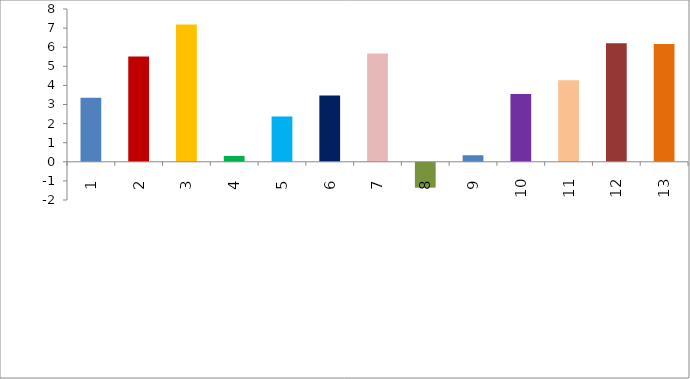
| Category | Series 0 |
|---|---|
| 0 | 3.351 |
| 1 | 5.513 |
| 2 | 7.192 |
| 3 | 0.31 |
| 4 | 2.373 |
| 5 | 3.476 |
| 6 | 5.676 |
| 7 | -1.355 |
| 8 | 0.343 |
| 9 | 3.551 |
| 10 | 4.273 |
| 11 | 6.205 |
| 12 | 6.169 |